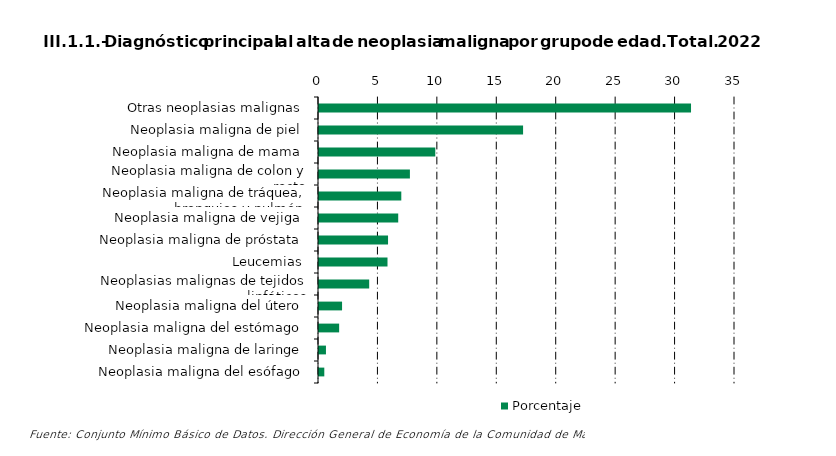
| Category | Porcentaje |
|---|---|
| Otras neoplasias malignas | 31.3 |
| Neoplasia maligna de piel | 17.17 |
| Neoplasia maligna de mama | 9.783 |
| Neoplasia maligna de colon y recto | 7.648 |
| Neoplasia maligna de tráquea, bronquios y pulmón | 6.924 |
| Neoplasia maligna de vejiga | 6.665 |
| Neoplasia maligna de próstata | 5.809 |
| Leucemias | 5.763 |
| Neoplasias malignas de tejidos linfáticos | 4.222 |
| Neoplasia maligna del útero | 1.941 |
| Neoplasia maligna del estómago | 1.695 |
| Neoplasia maligna de laringe | 0.585 |
| Neoplasia maligna del esófago | 0.446 |